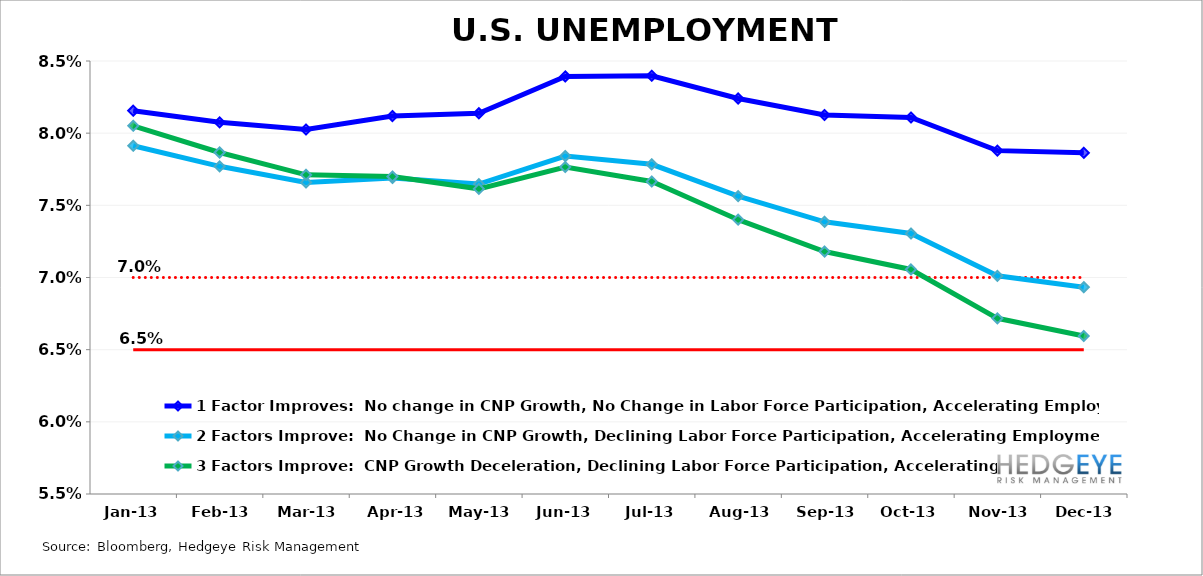
| Category | 1 Factor Improves:  No change in CNP Growth, No Change in Labor Force Participation, Accelerating Employment | 7% Unemployment | 6.5% Unemployment | 2 Factors Improve:  No Change in CNP Growth, Declining Labor Force Participation, Accelerating Employment | 3 Factors Improve:  CNP Growth Deceleration, Declining Labor Force Participation, Accelerating Employment |
|---|---|---|---|---|---|
| 2013-01-31 | 0.082 | 0.07 | 0.065 | 0.079 | 0.081 |
| 2013-02-28 | 0.081 | 0.07 | 0.065 | 0.078 | 0.079 |
| 2013-03-31 | 0.08 | 0.07 | 0.065 | 0.077 | 0.077 |
| 2013-04-30 | 0.081 | 0.07 | 0.065 | 0.077 | 0.077 |
| 2013-05-31 | 0.081 | 0.07 | 0.065 | 0.076 | 0.076 |
| 2013-06-30 | 0.084 | 0.07 | 0.065 | 0.078 | 0.078 |
| 2013-07-31 | 0.084 | 0.07 | 0.065 | 0.078 | 0.077 |
| 2013-08-31 | 0.082 | 0.07 | 0.065 | 0.076 | 0.074 |
| 2013-09-30 | 0.081 | 0.07 | 0.065 | 0.074 | 0.072 |
| 2013-10-31 | 0.081 | 0.07 | 0.065 | 0.073 | 0.071 |
| 2013-11-30 | 0.079 | 0.07 | 0.065 | 0.07 | 0.067 |
| 2013-12-31 | 0.079 | 0.07 | 0.065 | 0.069 | 0.066 |